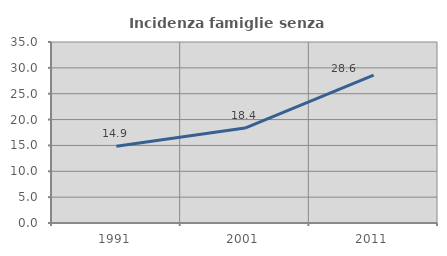
| Category | Incidenza famiglie senza nuclei |
|---|---|
| 1991.0 | 14.858 |
| 2001.0 | 18.35 |
| 2011.0 | 28.602 |